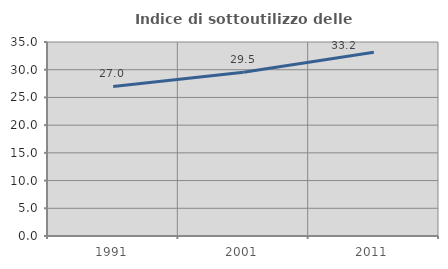
| Category | Indice di sottoutilizzo delle abitazioni  |
|---|---|
| 1991.0 | 26.99 |
| 2001.0 | 29.542 |
| 2011.0 | 33.156 |